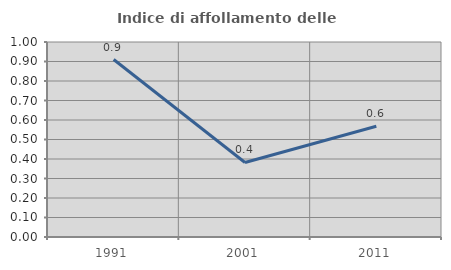
| Category | Indice di affollamento delle abitazioni  |
|---|---|
| 1991.0 | 0.91 |
| 2001.0 | 0.382 |
| 2011.0 | 0.568 |